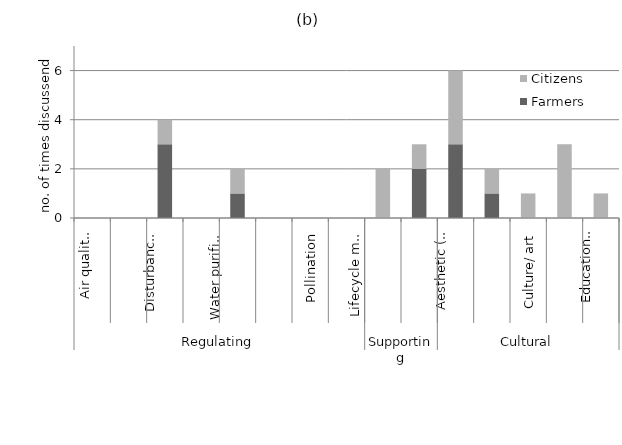
| Category | Farmers | Citizens |
|---|---|---|
| 0 | 0 | 0 |
| 1 | 0 | 0 |
| 2 | 3 | 1 |
| 3 | 0 | 0 |
| 4 | 1 | 1 |
| 5 | 0 | 0 |
| 6 | 0 | 0 |
| 7 | 0 | 0 |
| 8 | 0 | 2 |
| 9 | 2 | 1 |
| 10 | 3 | 3 |
| 11 | 1 | 1 |
| 12 | 0 | 1 |
| 13 | 0 | 3 |
| 14 | 0 | 1 |